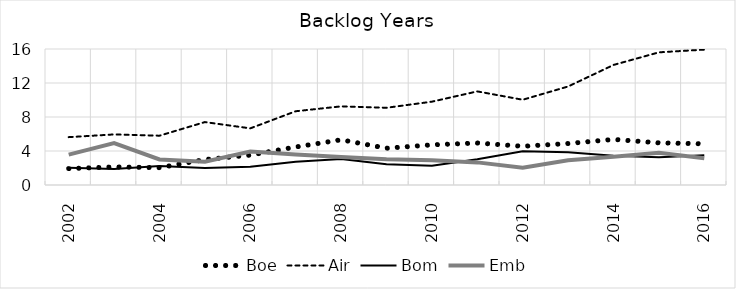
| Category | Boe | Air | Bom | Emb |
|---|---|---|---|---|
| 2002.0 | 1.927 | 5.63 | 2.021 | 3.577 |
| 2003.0 | 2.126 | 5.95 | 1.878 | 4.941 |
| 2004.0 | 2.038 | 5.802 | 2.231 | 3.012 |
| 2005.0 | 2.996 | 7.402 | 1.989 | 2.74 |
| 2006.0 | 3.52 | 6.665 | 2.146 | 3.939 |
| 2007.0 | 4.473 | 8.679 | 2.747 | 3.589 |
| 2008.0 | 5.317 | 9.251 | 3.061 | 3.294 |
| 2009.0 | 4.328 | 9.086 | 2.444 | 3.026 |
| 2010.0 | 4.727 | 9.803 | 2.262 | 2.898 |
| 2011.0 | 4.942 | 11.012 | 3.041 | 2.661 |
| 2012.0 | 4.558 | 10.03 | 3.972 | 2.021 |
| 2013.0 | 4.879 | 11.589 | 3.84 | 2.92 |
| 2014.0 | 5.367 | 14.124 | 3.436 | 3.327 |
| 2015.0 | 4.959 | 15.607 | 3.258 | 3.789 |
| 2016.0 | 4.846 | 15.926 | 3.489 | 3.156 |